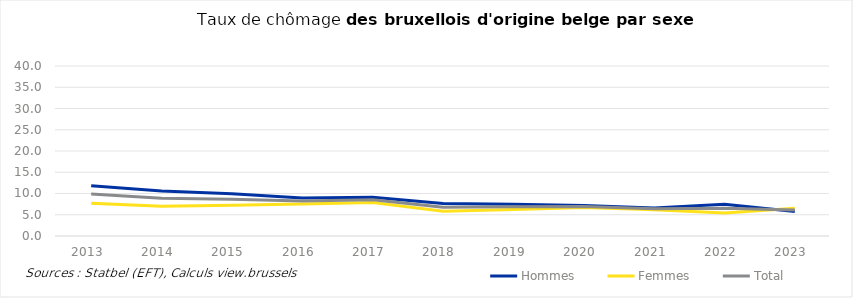
| Category | Hommes | Femmes | Total |
|---|---|---|---|
| 2013.0 | 11.803 | 7.708 | 9.881 |
| 2014.0 | 10.561 | 7.02 | 8.868 |
| 2015.0 | 9.948 | 7.234 | 8.657 |
| 2016.0 | 8.918 | 7.522 | 8.237 |
| 2017.0 | 9.124 | 7.893 | 8.549 |
| 2018.0 | 7.653 | 5.848 | 6.776 |
| 2019.0 | 7.477 | 6.222 | 6.872 |
| 2020.0 | 7.152 | 6.693 | 6.938 |
| 2021.0 | 6.572 | 6.166 | 6.39 |
| 2022.0 | 7.441 | 5.421 | 6.538 |
| 2023.0 | 5.775 | 6.535 | 6.126 |